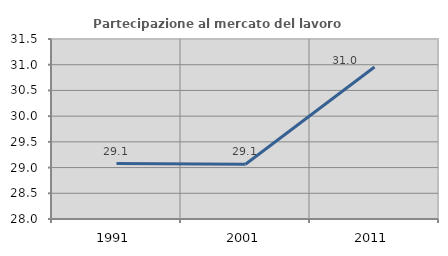
| Category | Partecipazione al mercato del lavoro  femminile |
|---|---|
| 1991.0 | 29.079 |
| 2001.0 | 29.065 |
| 2011.0 | 30.955 |